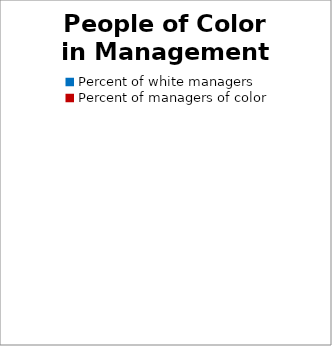
| Category | Series 0 |
|---|---|
| Percent of white managers | 0 |
| Percent of managers of color | 0 |